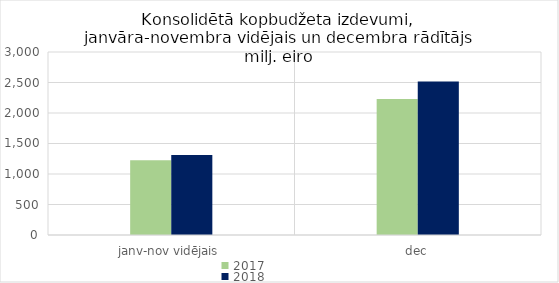
| Category | 2017 | 2018 |
|---|---|---|
| janv-nov vidējais | 1226693.247 | 1313509.048 |
| dec | 2230910.603 | 2516060.844 |